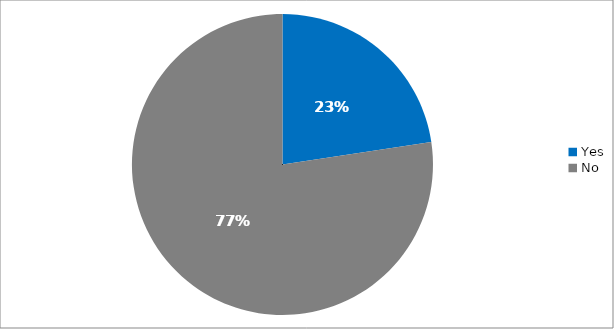
| Category | Responses |
|---|---|
| Yes | 0.226 |
| No | 0.774 |